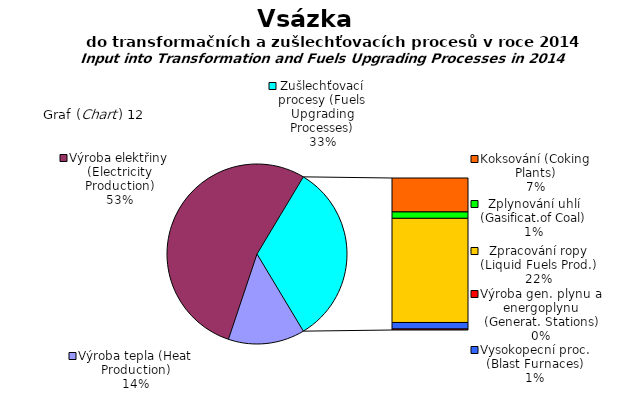
| Category | Výroba tepla (Heat Production) Výroba elektřiny (Electricity Production) Koksování (Coking Plants) Zplynování uhlí (Gasificat.of Coal) Zpracování ropy (Liquid Fuels Prod.) Vysokopecní proc. (Blast Furnaces) Výroba gen. plynu a energoplynu (Generat. Statio |
|---|---|
| Výroba tepla (Heat Production) | 201102 |
| Výroba elektřiny (Electricity Production) | 781422.8 |
| Koksování (Coking Plants) | 106990.868 |
| Zplynování uhlí (Gasificat.of Coal) | 20210.041 |
| Zpracování ropy (Liquid Fuels Prod.) | 328191.061 |
| Vysokopecní proc. (Blast Furnaces) | 20711.755 |
| Výroba gen. plynu a energoplynu (Generat. Stations) | 2997.464 |